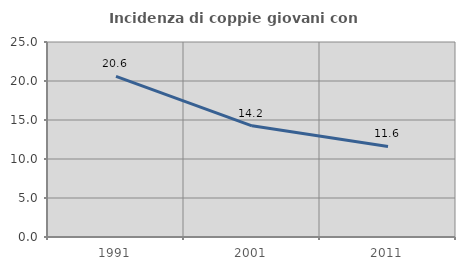
| Category | Incidenza di coppie giovani con figli |
|---|---|
| 1991.0 | 20.588 |
| 2001.0 | 14.249 |
| 2011.0 | 11.603 |